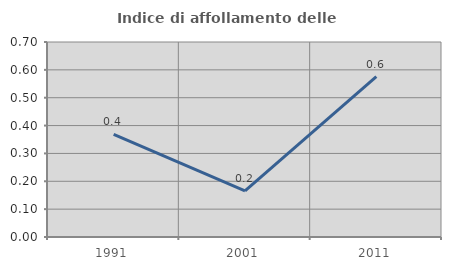
| Category | Indice di affollamento delle abitazioni  |
|---|---|
| 1991.0 | 0.368 |
| 2001.0 | 0.166 |
| 2011.0 | 0.576 |